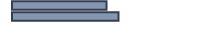
| Category | 47,0 |
|---|---|
| 0 | 47.022 |
| 1 | 52.978 |